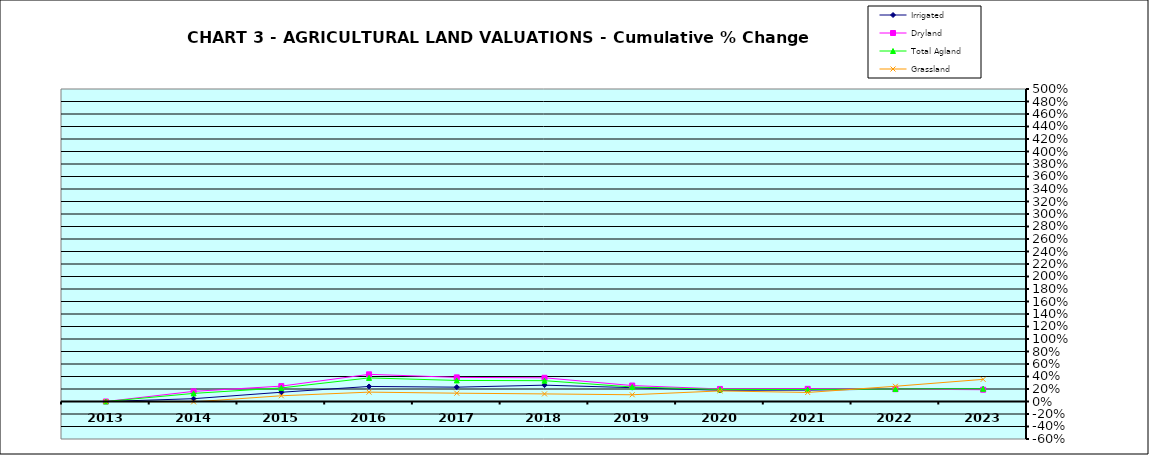
| Category | Irrigated | Dryland | Total Agland | Grassland |
|---|---|---|---|---|
| 2013.0 | 0 | 0 | 0 | 0 |
| 2014.0 | 0.045 | 0.162 | 0.13 | -0.006 |
| 2015.0 | 0.148 | 0.246 | 0.217 | 0.092 |
| 2016.0 | 0.241 | 0.435 | 0.378 | 0.15 |
| 2017.0 | 0.229 | 0.386 | 0.337 | 0.133 |
| 2018.0 | 0.261 | 0.379 | 0.333 | 0.121 |
| 2019.0 | 0.222 | 0.255 | 0.232 | 0.108 |
| 2020.0 | 0.179 | 0.201 | 0.193 | 0.169 |
| 2021.0 | 0.182 | 0.203 | 0.192 | 0.145 |
| 2022.0 | 0.199 | 0.197 | 0.2 | 0.244 |
| 2023.0 | 0.2 | 0.189 | 0.203 | 0.354 |